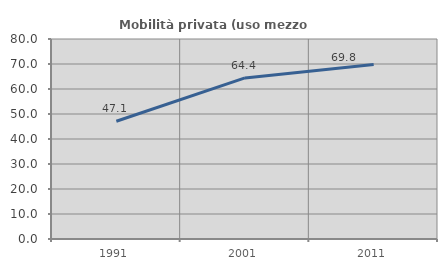
| Category | Mobilità privata (uso mezzo privato) |
|---|---|
| 1991.0 | 47.101 |
| 2001.0 | 64.433 |
| 2011.0 | 69.783 |